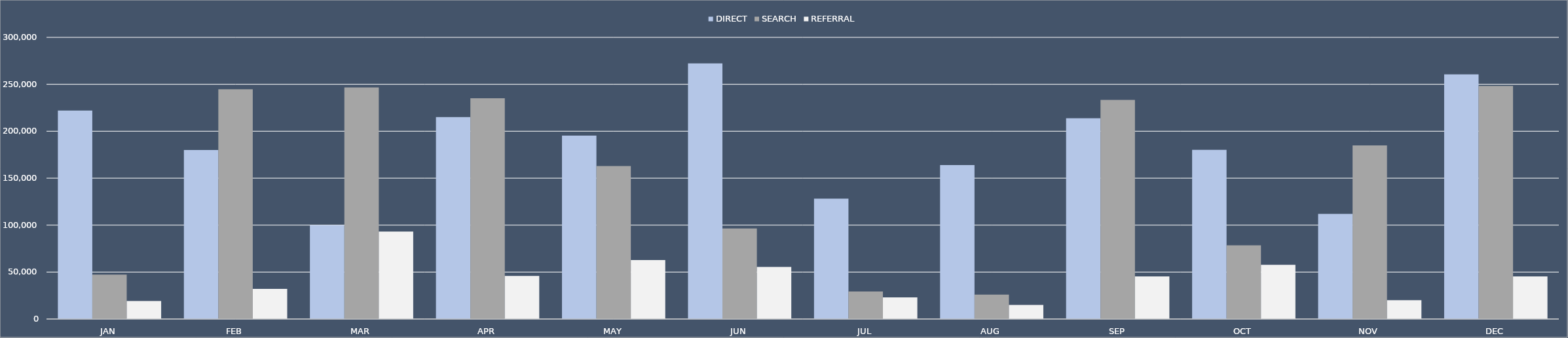
| Category | DIRECT | SEARCH | REFERRAL |
|---|---|---|---|
| JAN | 222006 | 47216 | 19193 |
| FEB | 180009 | 244714 | 32086 |
| MAR | 99998 | 246549 | 93117 |
| APR | 215030 | 235062 | 45862 |
| MAY | 195262 | 162881 | 62853 |
| JUN | 272260 | 96528 | 55513 |
| JUL | 128123 | 29235 | 22945 |
| AUG | 163950 | 25934 | 15084 |
| SEP | 213914 | 233397 | 45347 |
| OCT | 180191 | 78479 | 57736 |
| NOV | 111890 | 184799 | 20142 |
| DEC | 260495 | 248215 | 45284 |